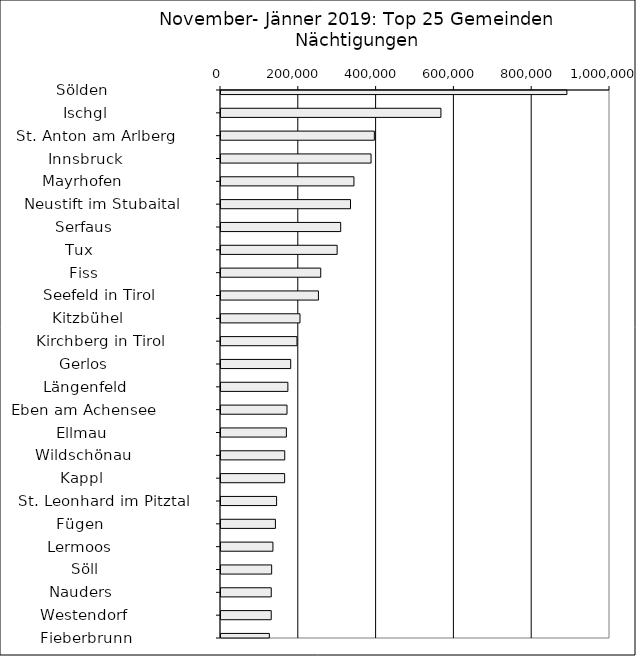
| Category | Series 0 |
|---|---|
|   Sölden                     | 889198 |
|   Ischgl                     | 565334 |
|   St. Anton am Arlberg       | 394208 |
|   Innsbruck                  | 385743 |
|   Mayrhofen                  | 341723 |
|   Neustift im Stubaital      | 332915 |
|   Serfaus                    | 307709 |
|   Tux                        | 298543 |
|   Fiss                       | 256400 |
|   Seefeld in Tirol           | 250506 |
|   Kitzbühel                  | 203051 |
|   Kirchberg in Tirol         | 195347 |
|   Gerlos                     | 179186 |
|   Längenfeld                 | 171928 |
|   Eben am Achensee           | 169705 |
|   Ellmau                     | 168091 |
|   Wildschönau                | 163871 |
|   Kappl                      | 163613 |
|   St. Leonhard im Pitztal    | 142927 |
|   Fügen                      | 139870 |
|   Lermoos                    | 133490 |
|   Söll                       | 130223 |
|   Nauders                    | 129181 |
|   Westendorf                 | 129112 |
|   Fieberbrunn                | 124293 |